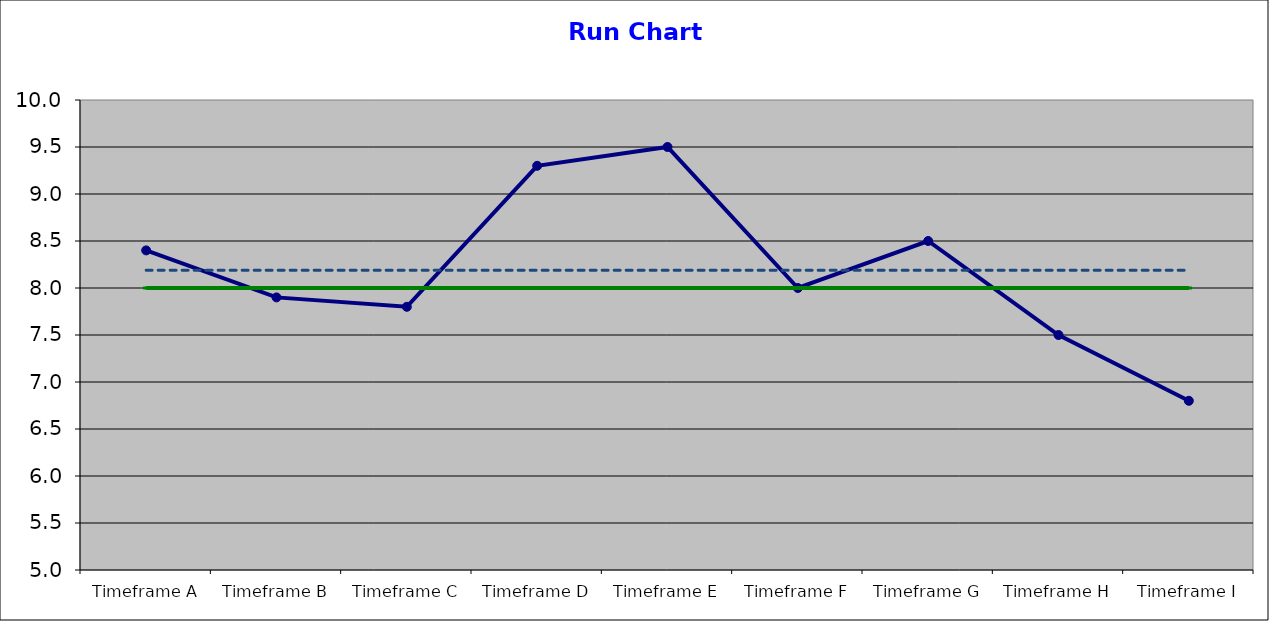
| Category | Series 0 | Series 1 | Series 2 |
|---|---|---|---|
| Timeframe A | 8.4 | 8 | 8.189 |
| Timeframe B | 7.9 | 8 | 8.189 |
| Timeframe C | 7.8 | 8 | 8.189 |
| Timeframe D | 9.3 | 8 | 8.189 |
| Timeframe E | 9.5 | 8 | 8.189 |
| Timeframe F | 8 | 8 | 8.189 |
| Timeframe G | 8.5 | 8 | 8.189 |
| Timeframe H | 7.5 | 8 | 8.189 |
| Timeframe I | 6.8 | 8 | 8.189 |